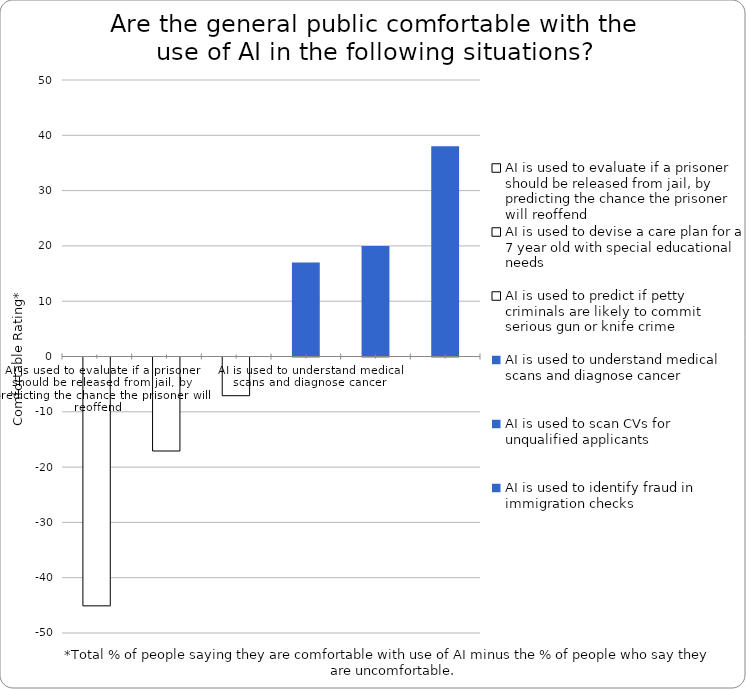
| Category | Series 0 |
|---|---|
| AI is used to evaluate if a prisoner should be released from jail, by predicting the chance the prisoner will reoffend | -45 |
| AI is used to devise a care plan for a 7 year old with special educational needs | -17 |
| AI is used to predict if petty criminals are likely to commit serious gun or knife crime | -7 |
| AI is used to understand medical scans and diagnose cancer | 17 |
| AI is used to scan CVs for unqualified applicants | 20 |
| AI is used to identify fraud in immigration checks | 38 |